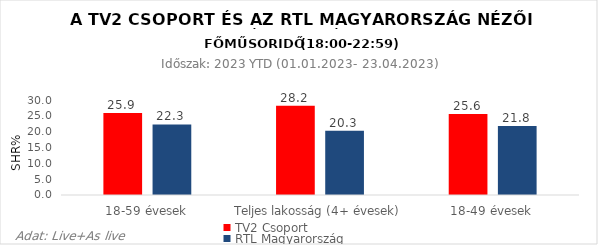
| Category | TV2 Csoport | RTL Magyarország |
|---|---|---|
| 18-59 évesek | 25.9 | 22.3 |
| Teljes lakosság (4+ évesek) | 28.2 | 20.3 |
| 18-49 évesek | 25.6 | 21.8 |